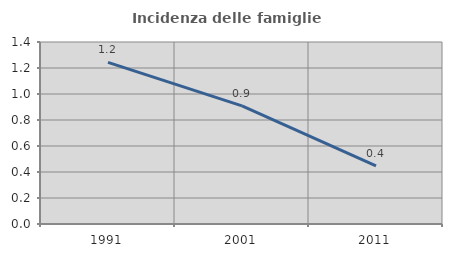
| Category | Incidenza delle famiglie numerose |
|---|---|
| 1991.0 | 1.244 |
| 2001.0 | 0.909 |
| 2011.0 | 0.446 |